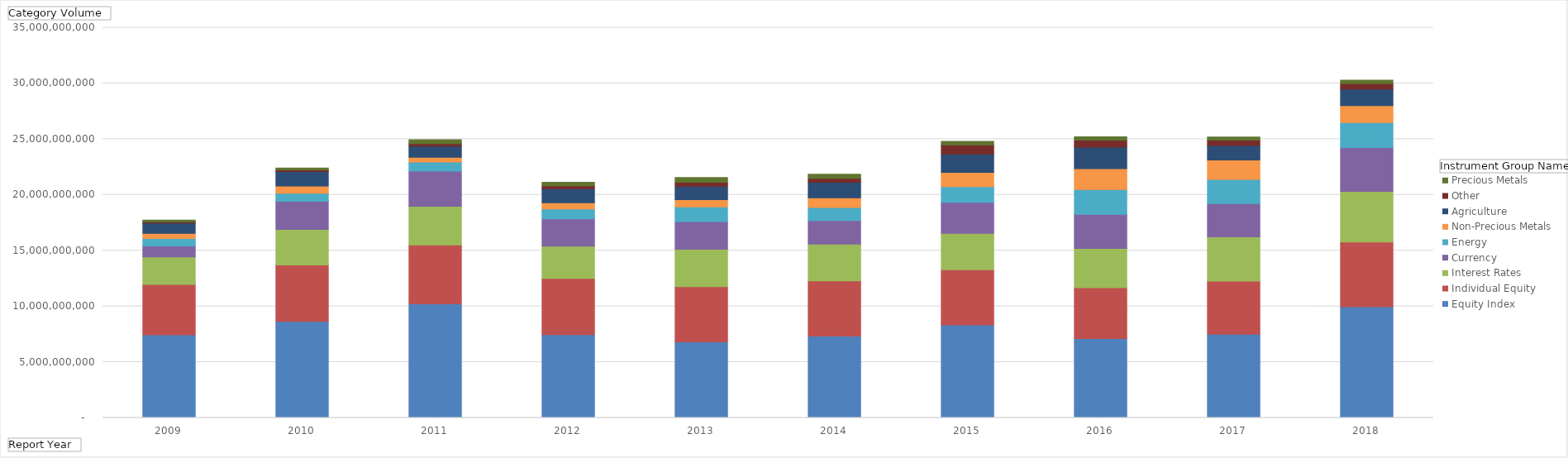
| Category | Equity Index | Individual Equity | Interest Rates | Currency | Energy | Non-Precious Metals | Agriculture | Other | Precious Metals |
|---|---|---|---|---|---|---|---|---|---|
| 2009 | 7449846538 | 4520849065 | 2464092298 | 990872926 | 657653860 | 462823525 | 927839377 | 114469433 | 151451722 |
| 2010 | 8664986804 | 5046629020 | 3196005638 | 2525981511 | 723618042 | 643646141 | 1305504989 | 137657192 | 174946553 |
| 2011 | 10228716966 | 5296596675 | 3455673679 | 3147464132 | 813511365 | 435115597 | 996805471 | 230305531 | 342134687 |
| 2012 | 7464351381 | 5054049740 | 2892935562 | 2434557602 | 901916480 | 554253753 | 1254451535 | 253203391 | 319434323 |
| 2013 | 6830177458 | 4946500754 | 3344450251 | 2497275021 | 1310960455 | 646353626 | 1211465802 | 345924587 | 433708193 |
| 2014 | 7339406137 | 4943659298 | 3300300084 | 2122783609 | 1160869956 | 872626126 | 1388095447 | 354372337 | 371064966 |
| 2015 | 8339938815 | 4944753556 | 3263181266 | 2785081607 | 1410908886 | 1280935517 | 1639886712 | 819711258 | 316685335 |
| 2016 | 7117919918 | 4557835036 | 3519100552 | 3073420689 | 2214163491 | 1877347635 | 1932074899 | 616015068 | 312137035 |
| 2017 | 7515905729 | 4754164789 | 3967995313 | 2984103494 | 2171206765 | 1740499534 | 1306068499 | 479809831 | 279133944 |
| 2018 | 9982558028 | 5787936188 | 4554195418 | 3928907250 | 2237728622 | 1523286916 | 1487729626 | 489018266 | 291136980 |